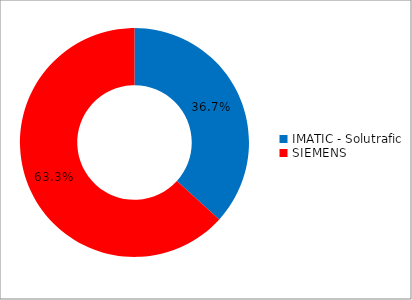
| Category | Series 0 |
|---|---|
| IMATIC - Solutrafic | 0.367 |
| SIEMENS | 0.633 |